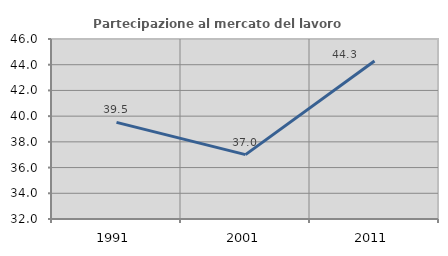
| Category | Partecipazione al mercato del lavoro  femminile |
|---|---|
| 1991.0 | 39.516 |
| 2001.0 | 37.008 |
| 2011.0 | 44.286 |